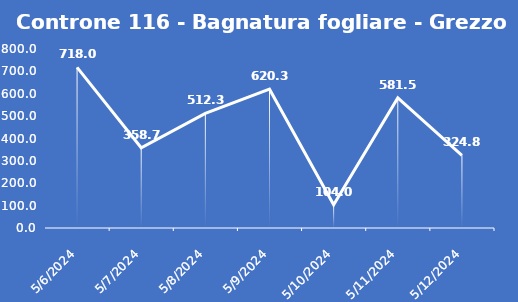
| Category | Controne 116 - Bagnatura fogliare - Grezzo (min) |
|---|---|
| 5/6/24 | 718 |
| 5/7/24 | 358.7 |
| 5/8/24 | 512.3 |
| 5/9/24 | 620.3 |
| 5/10/24 | 104 |
| 5/11/24 | 581.5 |
| 5/12/24 | 324.8 |